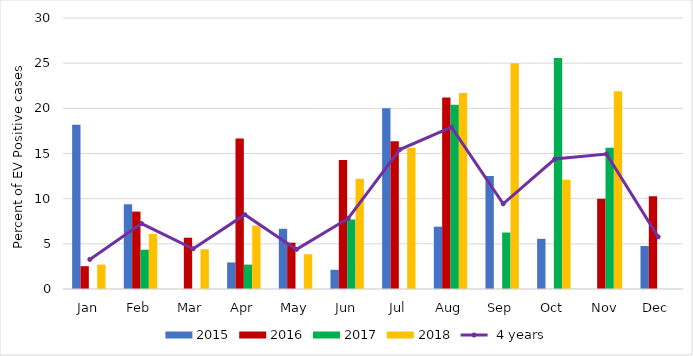
| Category | 2015 | 2016 | 2017 | 2018 |
|---|---|---|---|---|
| Jan | 18.18 | 2.53 | 0 | 2.7 |
| Feb | 9.375 | 8.57 | 4.35 | 6.1 |
| Mar | 0 | 5.68 | 0 | 4.4 |
| Apr | 2.94 | 16.67 | 2.7 | 7.01 |
| May | 6.666 | 5.128 | 0 | 3.84 |
| Jun | 2.127 | 14.286 | 7.69 | 12.2 |
| Jul | 20 | 16.36 | 0 | 15.6 |
| Aug | 6.896 | 21.21 | 20.408 | 21.7 |
| Sep | 12.5 | 0 | 6.25 | 25 |
| Oct | 5.555 | 0 | 25.58 | 12.1 |
| Nov | 0 | 10 | 15.625 | 21.9 |
| Dec | 4.76 | 10.256 | 0 | 0 |